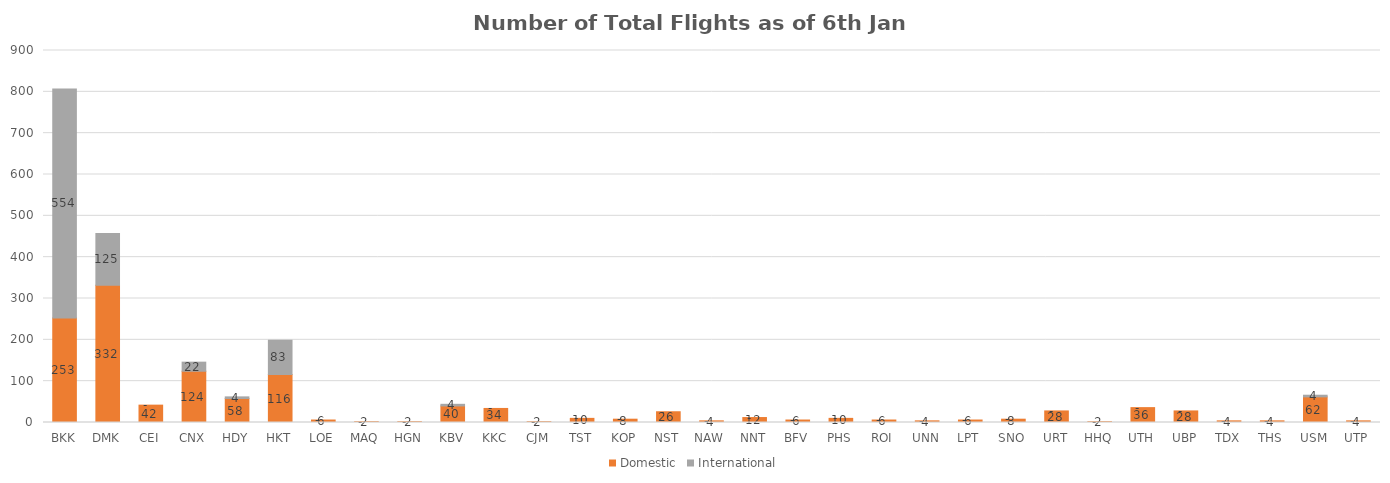
| Category | Domestic | International |
|---|---|---|
| BKK | 253 | 554 |
| DMK | 332 | 125 |
| CEI | 42 | 0 |
| CNX | 124 | 22 |
| HDY | 58 | 4 |
| HKT | 116 | 83 |
| LOE | 6 | 0 |
| MAQ | 2 | 0 |
| HGN | 2 | 0 |
| KBV | 40 | 4 |
| KKC | 34 | 0 |
| CJM | 2 | 0 |
| TST | 10 | 0 |
| KOP | 8 | 0 |
| NST | 26 | 0 |
| NAW | 4 | 0 |
| NNT | 12 | 0 |
| BFV | 6 | 0 |
| PHS | 10 | 0 |
| ROI | 6 | 0 |
| UNN | 4 | 0 |
| LPT | 6 | 0 |
| SNO | 8 | 0 |
| URT | 28 | 0 |
| HHQ | 2 | 0 |
| UTH | 36 | 0 |
| UBP | 28 | 0 |
| TDX | 4 | 0 |
| THS | 4 | 0 |
| USM | 62 | 4 |
| UTP | 4 | 0 |